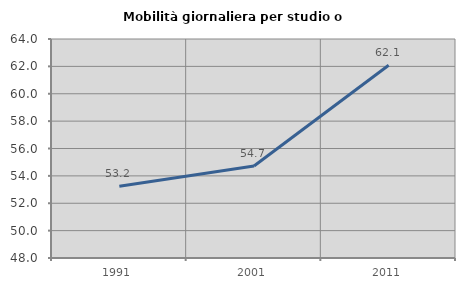
| Category | Mobilità giornaliera per studio o lavoro |
|---|---|
| 1991.0 | 53.238 |
| 2001.0 | 54.717 |
| 2011.0 | 62.081 |